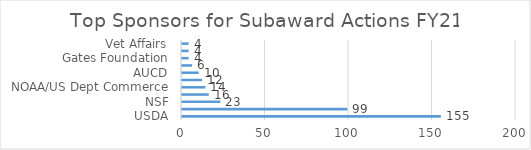
| Category | FY21 |
|---|---|
| USDA | 155 |
| NIH | 99 |
| NSF | 23 |
| St of VT/US Forest | 16 |
| NOAA/US Dept Commerce | 14 |
| NASA | 12 |
| AUCD | 10 |
| EPA  | 6 |
| Gates Foundation | 4 |
| PCORI | 4 |
| Vet Affairs | 4 |